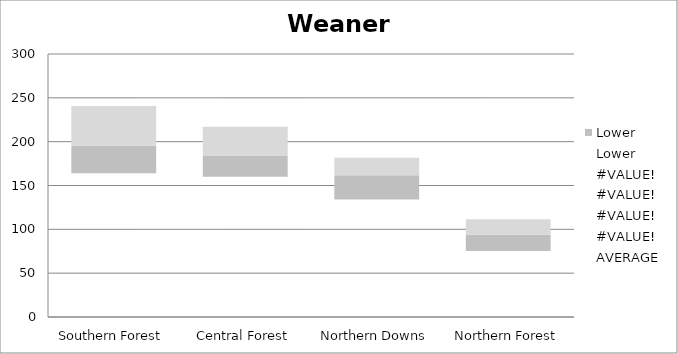
| Category | Lower | Upper |
|---|---|---|
| Southern Forest | 31.1 | 45.6 |
| Central Forest | 24.2 | 32.8 |
| Northern Downs | 27.8 | 19.8 |
| Northern Forest | 18.6 | 17.6 |